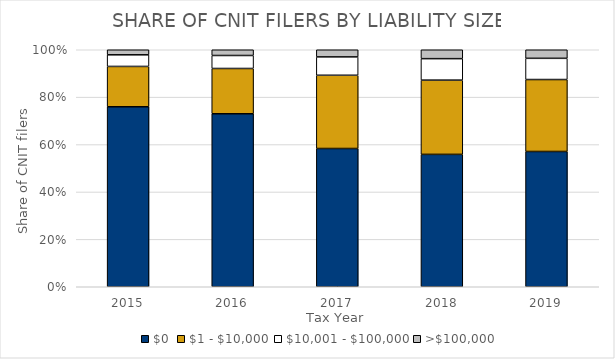
| Category | $0  | $1 - $10,000 | $10,001 - $100,000 | >$100,000 |
|---|---|---|---|---|
| 2015.0 | 94228 | 21112 | 6080 | 2649 |
| 2016.0 | 79863 | 20904 | 5993 | 2653 |
| 2017.0 | 56624 | 29998 | 7515 | 2929 |
| 2018.0 | 52378 | 29379 | 8493 | 3523 |
| 2019.0 | 52890 | 28135 | 8287 | 3353 |